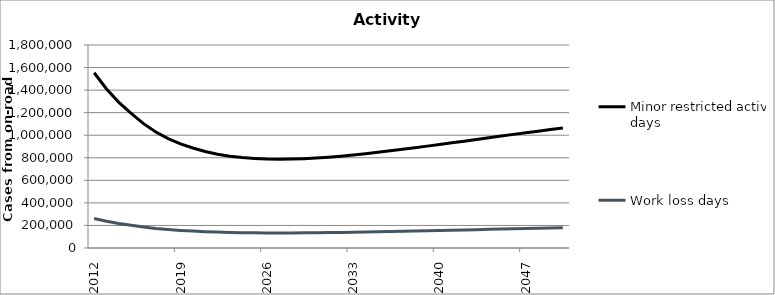
| Category | Minor restricted activity days | Work loss days |
|---|---|---|
| 2012.0 | 1553825.341 | 261813.378 |
| 2013.0 | 1410178.685 | 237586.375 |
| 2014.0 | 1291262.208 | 217576.97 |
| 2015.0 | 1193800.378 | 201213.084 |
| 2016.0 | 1102813.045 | 185966.549 |
| 2017.0 | 1028948.972 | 173619.852 |
| 2018.0 | 969702.316 | 163743.237 |
| 2019.0 | 923057.25 | 155990.077 |
| 2020.0 | 886732.529 | 149971.914 |
| 2021.0 | 855342.393 | 144782.841 |
| 2022.0 | 831533.019 | 140866.082 |
| 2023.0 | 814138.603 | 138023.807 |
| 2024.0 | 802077.259 | 136071.507 |
| 2025.0 | 794643.976 | 134888.926 |
| 2026.0 | 789522.52 | 134086.499 |
| 2027.0 | 787693.015 | 133826.551 |
| 2028.0 | 788687.866 | 134030.202 |
| 2029.0 | 792073.003 | 134624.136 |
| 2030.0 | 797604.059 | 135567.075 |
| 2031.0 | 804834.327 | 136786.02 |
| 2032.0 | 813732.519 | 138272.736 |
| 2033.0 | 824250.165 | 140020.184 |
| 2034.0 | 836014.978 | 141966.318 |
| 2035.0 | 848713.154 | 144059.201 |
| 2036.0 | 861423.614 | 146145.568 |
| 2037.0 | 874802.084 | 148333.773 |
| 2038.0 | 888795.396 | 150621.298 |
| 2039.0 | 903347.58 | 153007.943 |
| 2040.0 | 918403.474 | 155490.751 |
| 2041.0 | 932723.131 | 157862.393 |
| 2042.0 | 947421.396 | 160310.575 |
| 2043.0 | 962501.89 | 162835.181 |
| 2044.0 | 977741.989 | 165395.562 |
| 2045.0 | 993072.007 | 167977.869 |
| 2046.0 | 1007466.213 | 170411.505 |
| 2047.0 | 1021815.534 | 172844.62 |
| 2048.0 | 1036078.215 | 175270.047 |
| 2049.0 | 1050329.058 | 177700.13 |
| 2050.0 | 1064637.794 | 180146.076 |